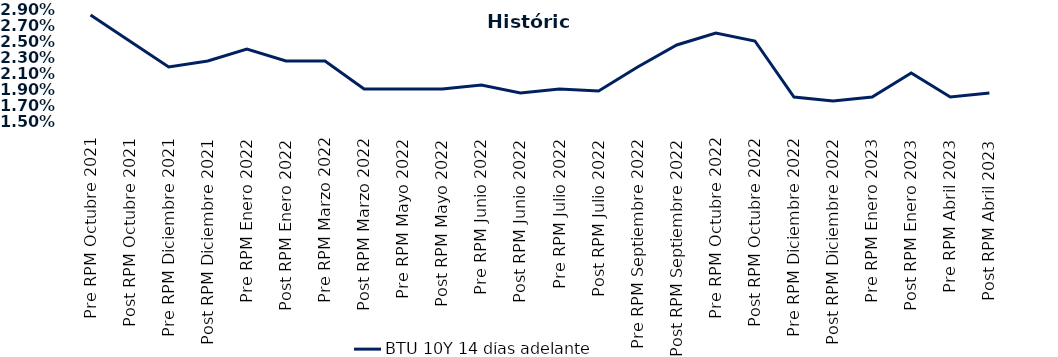
| Category | BTU 10Y 14 días adelante |
|---|---|
| Pre RPM Octubre 2021 | 0.028 |
| Post RPM Octubre 2021 | 0.025 |
| Pre RPM Diciembre 2021 | 0.022 |
| Post RPM Diciembre 2021 | 0.022 |
| Pre RPM Enero 2022 | 0.024 |
| Post RPM Enero 2022 | 0.022 |
| Pre RPM Marzo 2022 | 0.022 |
| Post RPM Marzo 2022 | 0.019 |
| Pre RPM Mayo 2022 | 0.019 |
| Post RPM Mayo 2022 | 0.019 |
| Pre RPM Junio 2022 | 0.02 |
| Post RPM Junio 2022 | 0.018 |
| Pre RPM Julio 2022 | 0.019 |
| Post RPM Julio 2022 | 0.019 |
| Pre RPM Septiembre 2022 | 0.022 |
| Post RPM Septiembre 2022 | 0.024 |
| Pre RPM Octubre 2022 | 0.026 |
| Post RPM Octubre 2022 | 0.025 |
| Pre RPM Diciembre 2022 | 0.018 |
| Post RPM Diciembre 2022 | 0.018 |
| Pre RPM Enero 2023 | 0.018 |
| Post RPM Enero 2023 | 0.021 |
| Pre RPM Abril 2023 | 0.018 |
| Post RPM Abril 2023 | 0.018 |